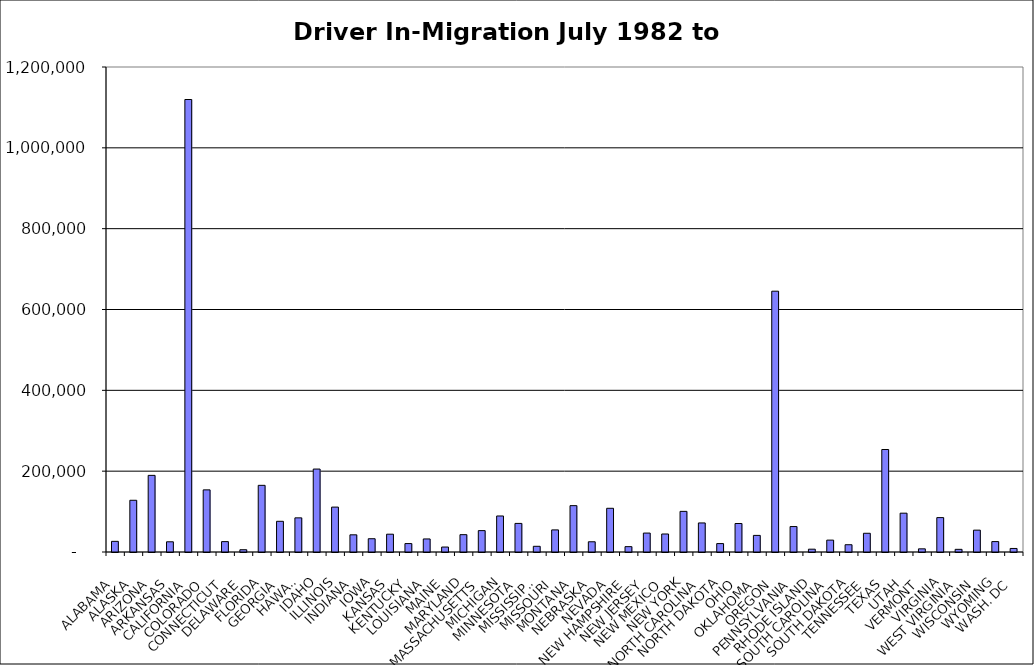
| Category | Series 0 |
|---|---|
| ALABAMA | 26340.5 |
| ALASKA | 128001.5 |
| ARIZONA | 189613 |
| ARKANSAS | 25273.5 |
| CALIFORNIA | 1119583.5 |
| COLORADO | 153715 |
| CONNECTICUT | 25690 |
| DELAWARE | 5631.5 |
| FLORIDA | 164928 |
| GEORGIA | 75962 |
| HAWAII | 84490.5 |
| IDAHO | 205220.5 |
| ILLINOIS | 111104.5 |
| INDIANA | 42522 |
| IOWA | 32852.5 |
| KANSAS | 44051.5 |
| KENTUCKY | 20853 |
| LOUISIANA | 32288.5 |
| MAINE | 12269.5 |
| MARYLAND | 42901 |
| MASSACHUSETTS | 52921 |
| MICHIGAN | 89145 |
| MINNESOTA | 70739.5 |
| MISSISSIPPI | 14085 |
| MISSOURI | 54674 |
| MONTANA | 114703 |
| NEBRASKA | 25293.5 |
| NEVADA | 108152 |
| NEW HAMPSHIRE | 13224.5 |
| NEW JERSEY | 46846 |
| NEW MEXICO | 44566 |
| NEW YORK | 100529 |
| NORTH CAROLINA | 71873.5 |
| NORTH DAKOTA | 20807.5 |
| OHIO | 70488.5 |
| OKLAHOMA | 41078 |
| OREGON | 645301 |
| PENNSYLVANIA | 62972.5 |
| RHODE ISLAND | 6985 |
| SOUTH CAROLINA | 29392.5 |
| SOUTH DAKOTA | 18000.5 |
| TENNESSEE | 46331.5 |
| TEXAS | 253600 |
| UTAH | 96044.5 |
| VERMONT | 7818 |
| VIRGINIA | 85094 |
| WEST VIRGINIA | 6610.5 |
| WISCONSIN | 54070.5 |
| WYOMING | 25780 |
| WASH. DC | 8755 |